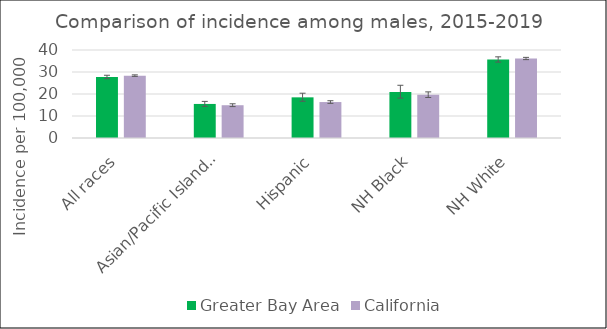
| Category | Greater Bay Area | California | SEER 18 |
|---|---|---|---|
| All races | 27.74 | 28.35 |  |
| Asian/Pacific Islander | 15.48 | 14.9 |  |
| Hispanic | 18.48 | 16.34 |  |
| NH Black | 20.9 | 19.66 |  |
| NH White | 35.68 | 36.13 |  |